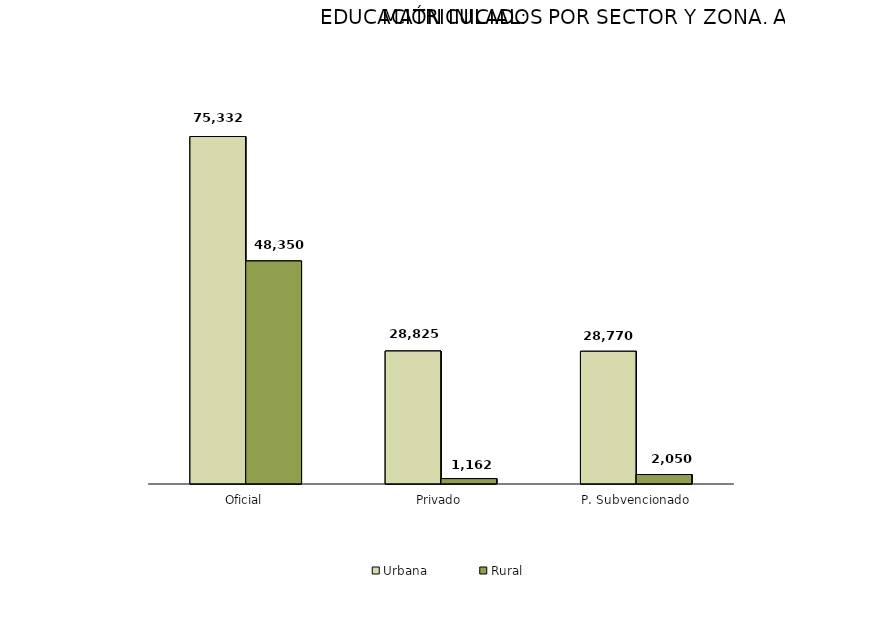
| Category | Urbana | Rural |
|---|---|---|
| Oficial | 75332 | 48350 |
| Privado | 28825 | 1162 |
| P. Subvencionado | 28770 | 2050 |